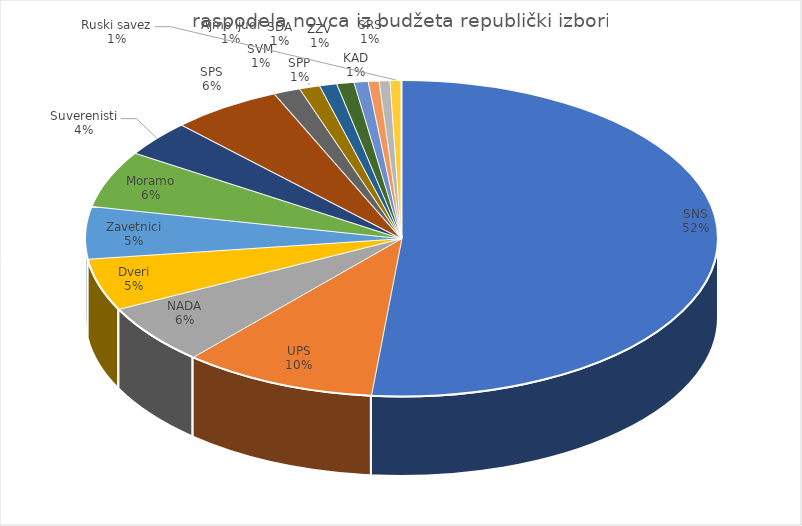
| Category | ukupno budžet EUR |
|---|---|
| SNS | 8082001.254 |
| UPS | 1557072.416 |
| NADA | 963968.352 |
| Dveri | 835032.685 |
| Zavetnici | 835032.685 |
| Moramo | 912394.085 |
| Suverenisti | 577161.353 |
| SPS | 886519.826 |
| SVM | 216054.362 |
| SPP | 164480.096 |
| ZZV | 138692.962 |
| SDA | 138692.962 |
| KAD | 112905.829 |
| SRS | 87118.696 |
| Ajmo ljudi | 87118.696 |
| Ruski savez | 87118.696 |